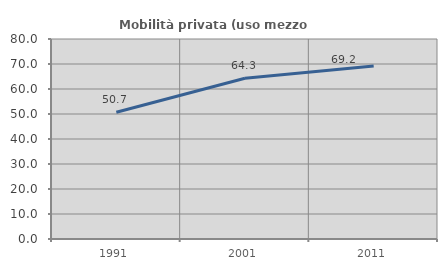
| Category | Mobilità privata (uso mezzo privato) |
|---|---|
| 1991.0 | 50.673 |
| 2001.0 | 64.286 |
| 2011.0 | 69.19 |